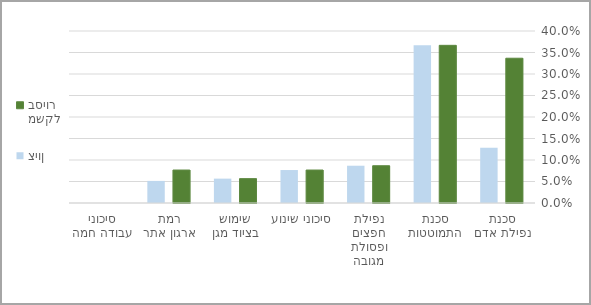
| Category | משקל בסיור | ציון |
|---|---|---|
| סכנת נפילת אדם | 0.337 | 0.129 |
| סכנת התמוטטות | 0.367 | 0.367 |
| נפילת חפצים ופסולת מגובה | 0.087 | 0.087 |
| סיכוני שינוע | 0.077 | 0.077 |
| שימוש בציוד מגן | 0.057 | 0.057 |
| רמת ארגון אתר | 0.077 | 0.051 |
| סיכוני עבודה חמה | 0 | 0 |